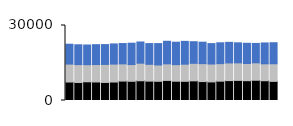
| Category | South Item1 | South Item2 | South Item3 |
|---|---|---|---|
| 0 | 7388 | 7175 | 7949 |
| 1 | 7199 | 7162 | 7927 |
| 2 | 7479 | 6847 | 7875 |
| 3 | 7410 | 6959 | 7963 |
| 4 | 7225 | 7198 | 7947 |
| 5 | 7381 | 7177 | 8073 |
| 6 | 7767 | 6888 | 8132 |
| 7 | 7682 | 6700 | 8541 |
| 8 | 7896 | 7027 | 8487 |
| 9 | 7743 | 6728 | 8302 |
| 10 | 7678 | 6520 | 8569 |
| 11 | 8032 | 6633 | 9027 |
| 12 | 7702 | 6645 | 8967 |
| 13 | 7670 | 6849 | 9141 |
| 14 | 7858 | 7013 | 8648 |
| 15 | 7573 | 7176 | 8575 |
| 16 | 7437 | 7153 | 8168 |
| 17 | 7731 | 7014 | 8342 |
| 18 | 7953 | 7078 | 8228 |
| 19 | 8043 | 7013 | 8014 |
| 20 | 7924 | 6865 | 8104 |
| 21 | 8097 | 6972 | 7765 |
| 22 | 7899 | 6781 | 8345 |
| 23 | 7647 | 7049 | 8420 |